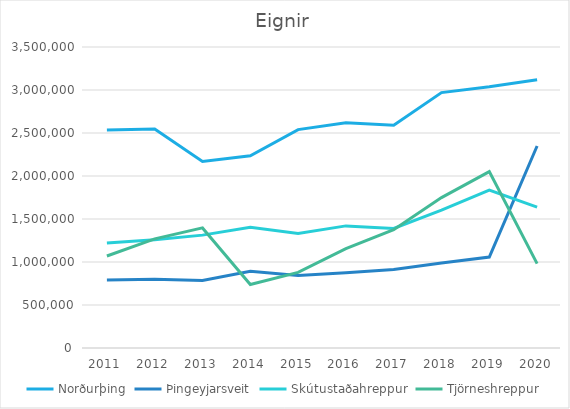
| Category | Norðurþing | Þingeyjarsveit | Skútustaðahreppur | Tjörneshreppur |
|---|---|---|---|---|
| 2011.0 | 2534820.833 | 790385.291 | 1220163.212 | 1069584.375 |
| 2012.0 | 2546513.268 | 798634.573 | 1259113.757 | 1269109.091 |
| 2013.0 | 2169322.821 | 786249.727 | 1312517.52 | 1396400 |
| 2014.0 | 2234996 | 891523 | 1403939 | 738559 |
| 2015.0 | 2539394 | 843731 | 1330953 | 879500 |
| 2016.0 | 2619516.706 | 876049.18 | 1419844.706 | 1156372.881 |
| 2017.0 | 2590033 | 913314 | 1389982 | 1376433 |
| 2018.0 | 2969813.938 | 987582.774 | 1602241.036 | 1748834.545 |
| 2019.0 | 3037081 | 1057246 | 1836750 | 2051255 |
| 2020.0 | 3119000 | 2349000 | 1639000 | 981000 |